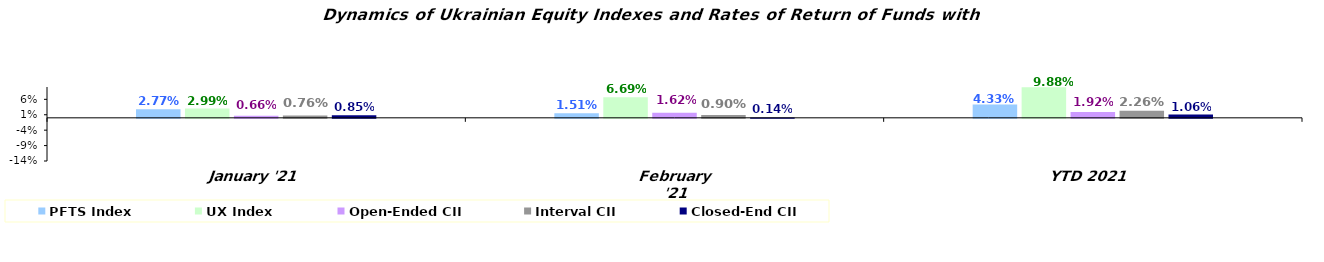
| Category | PFTS Index | UX Index | Open-Ended CII | Interval CII | Closed-End CII |
|---|---|---|---|---|---|
| January '21 | 0.028 | 0.03 | 0.007 | 0.008 | 0.009 |
| February '21 | 0.015 | 0.067 | 0.016 | 0.009 | 0.001 |
| YTD 2021  | 0.043 | 0.099 | 0.019 | 0.023 | 0.011 |